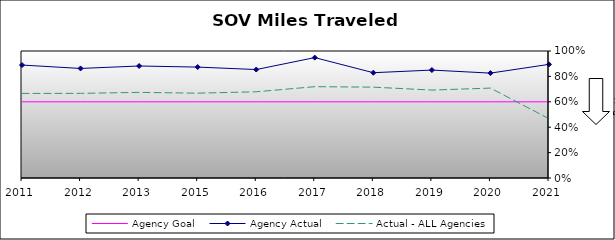
| Category | Agency Goal | Agency Actual | Actual - ALL Agencies |
|---|---|---|---|
| 2011.0 | 0.6 | 0.889 | 0.666 |
| 2012.0 | 0.6 | 0.863 | 0.666 |
| 2013.0 | 0.6 | 0.882 | 0.674 |
| 2015.0 | 0.6 | 0.873 | 0.668 |
| 2016.0 | 0.6 | 0.854 | 0.679 |
| 2017.0 | 0.6 | 0.948 | 0.719 |
| 2018.0 | 0.6 | 0.829 | 0.715 |
| 2019.0 | 0.6 | 0.85 | 0.692 |
| 2020.0 | 0.6 | 0.826 | 0.708 |
| 2021.0 | 0.6 | 0.895 | 0.467 |